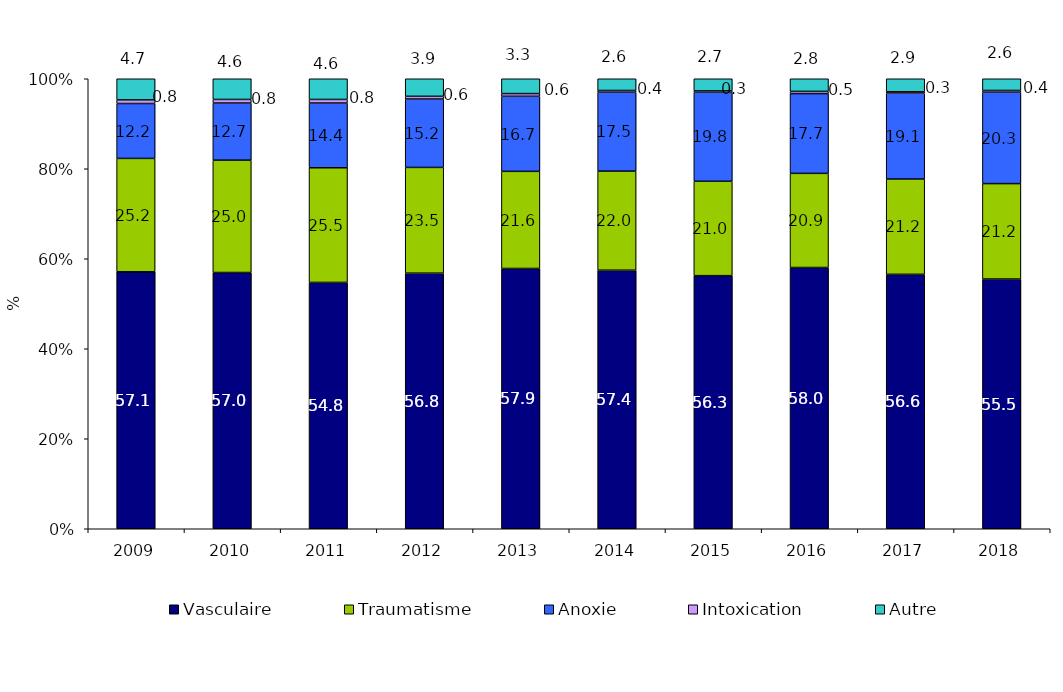
| Category | Vasculaire | Traumatisme | Anoxie | Intoxication | Autre |
|---|---|---|---|---|---|
| 2009.0 | 57.1 | 25.2 | 12.2 | 0.8 | 4.7 |
| 2010.0 | 57 | 25 | 12.7 | 0.8 | 4.6 |
| 2011.0 | 54.8 | 25.5 | 14.4 | 0.8 | 4.6 |
| 2012.0 | 56.8 | 23.5 | 15.2 | 0.6 | 3.9 |
| 2013.0 | 57.9 | 21.6 | 16.7 | 0.6 | 3.3 |
| 2014.0 | 57.4 | 22 | 17.5 | 0.4 | 2.6 |
| 2015.0 | 56.3 | 21 | 19.8 | 0.3 | 2.7 |
| 2016.0 | 58 | 20.9 | 17.7 | 0.5 | 2.8 |
| 2017.0 | 56.6 | 21.2 | 19.1 | 0.3 | 2.9 |
| 2018.0 | 55.5 | 21.2 | 20.3 | 0.4 | 2.6 |